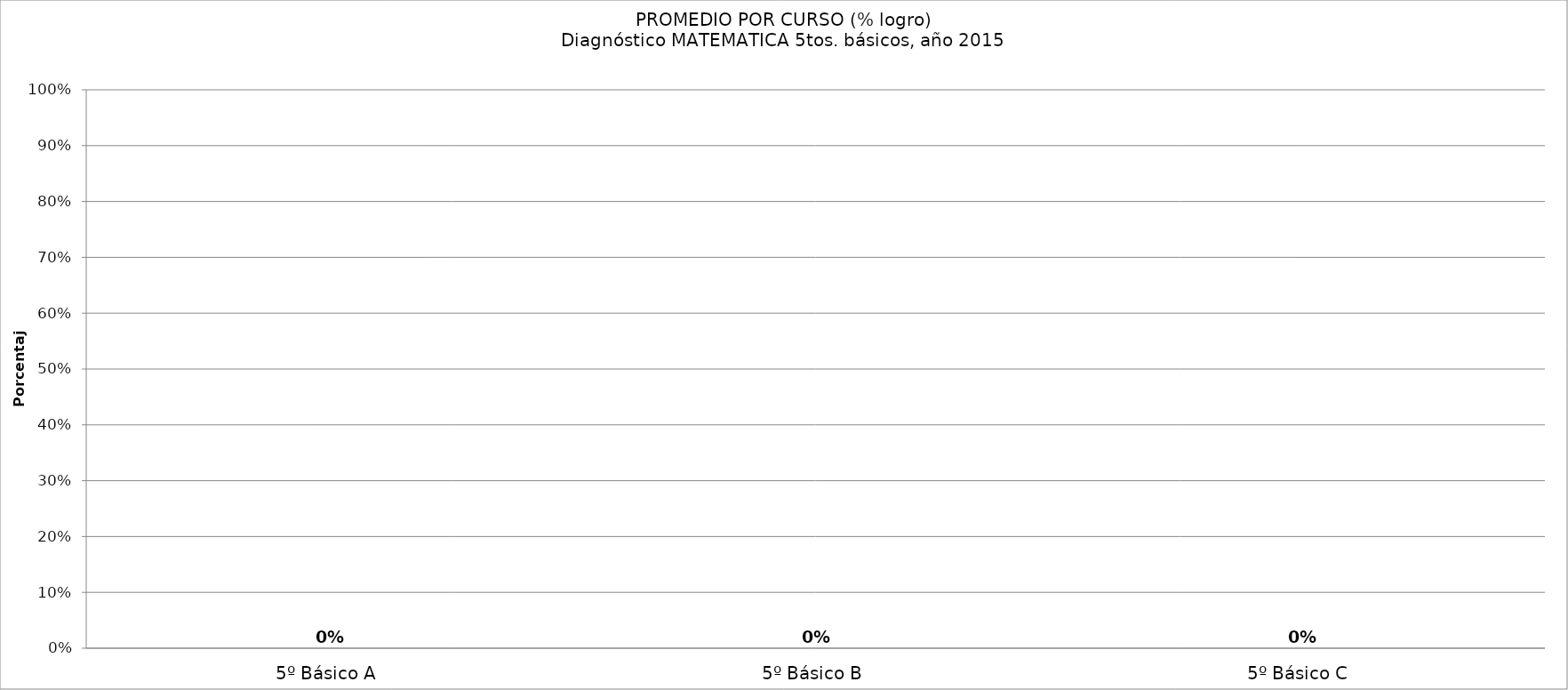
| Category | Series 0 |
|---|---|
| 5º Básico A | 0 |
| 5º Básico B | 0 |
| 5º Básico C | 0 |